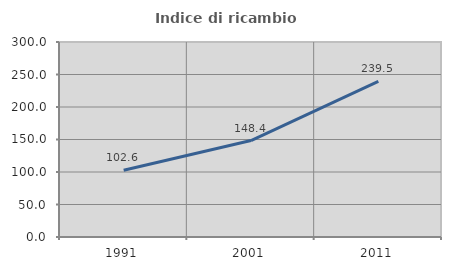
| Category | Indice di ricambio occupazionale  |
|---|---|
| 1991.0 | 102.632 |
| 2001.0 | 148.387 |
| 2011.0 | 239.474 |